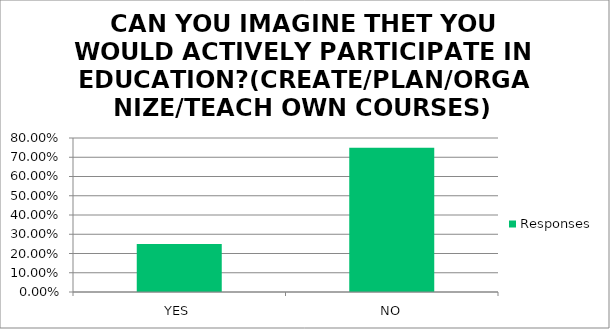
| Category | Responses |
|---|---|
| YES | 0.25 |
| NO | 0.75 |